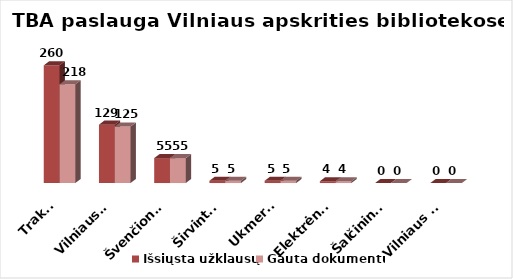
| Category | Išsiųsta užklausų | Gauta dokumentų |
|---|---|---|
| Trakai | 260 | 218 |
| Vilniaus r. | 129 | 125 |
| Švenčionys | 55 | 55 |
| Širvintos | 5 | 5 |
| Ukmergė | 5 | 5 |
| Elektrėnai | 4 | 4 |
| Šalčininkai | 0 | 0 |
| Vilniaus m. | 0 | 0 |